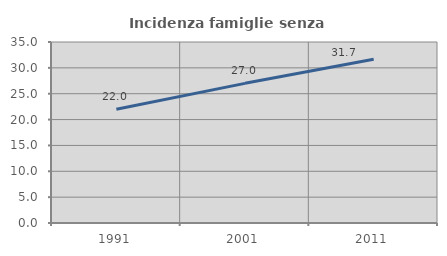
| Category | Incidenza famiglie senza nuclei |
|---|---|
| 1991.0 | 21.978 |
| 2001.0 | 27.004 |
| 2011.0 | 31.671 |